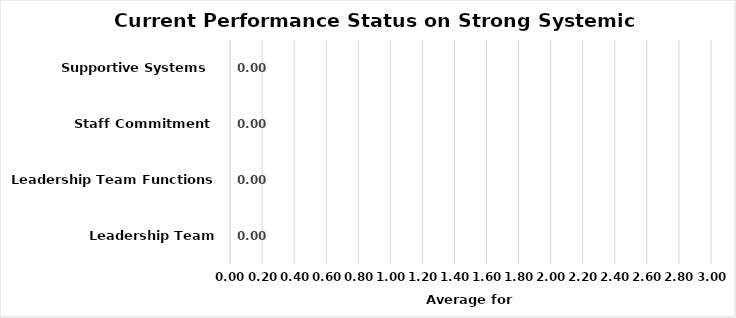
| Category | Current Performance Status on
Strong Systemic Support |
|---|---|
| Leadership Team Membership | 0 |
| Leadership Team Functions | 0 |
| Staff Commitment | 0 |
| Supportive Systems | 0 |